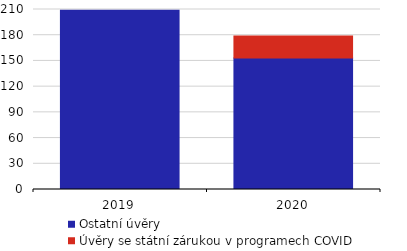
| Category | Ostatní úvěry | Úvěry se státní zárukou v programech COVID  |
|---|---|---|
| 2019.0 | 209.015 | 0 |
| 2020.0 | 153.4 | 25.8 |